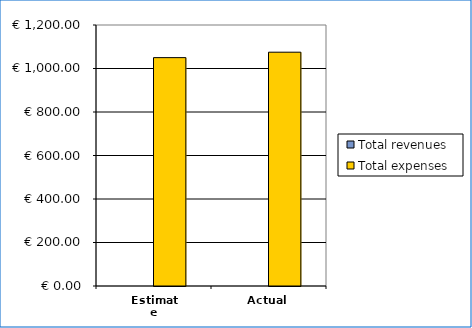
| Category | Total revenues | Total expenses |
|---|---|---|
| Estimate | 0 | 1050 |
| Actual | 0 | 1075 |